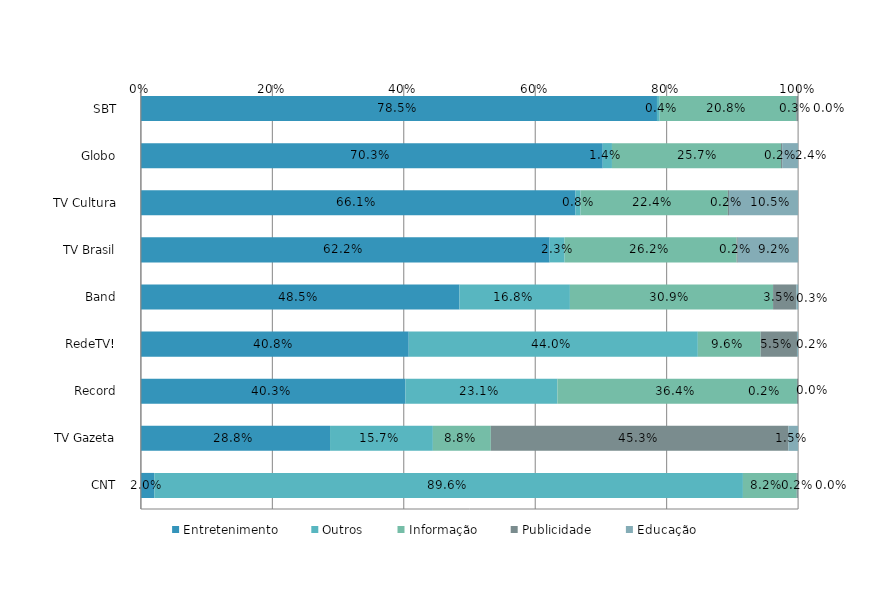
| Category | Entretenimento | Outros | Informação | Publicidade | Educação |
|---|---|---|---|---|---|
| SBT | 0.785 | 0.004 | 0.208 | 0.003 | 0 |
| Globo | 0.703 | 0.014 | 0.257 | 0.002 | 0.024 |
| TV Cultura | 0.661 | 0.008 | 0.224 | 0.002 | 0.105 |
| TV Brasil | 0.622 | 0.023 | 0.262 | 0.002 | 0.092 |
| Band | 0.485 | 0.168 | 0.309 | 0.035 | 0.003 |
| RedeTV! | 0.408 | 0.44 | 0.096 | 0.055 | 0.002 |
| Record | 0.403 | 0.231 | 0.364 | 0.002 | 0 |
| TV Gazeta | 0.288 | 0.157 | 0.088 | 0.453 | 0.015 |
| CNT | 0.02 | 0.896 | 0.082 | 0.002 | 0 |